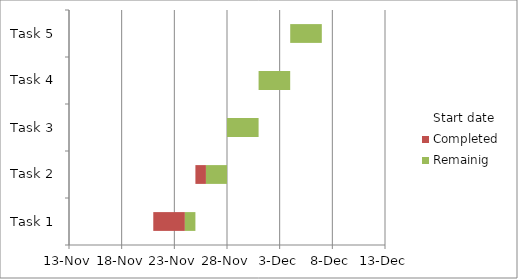
| Category | Start date | Completed | Remainig |
|---|---|---|---|
| Task 1 | 2011-11-21 | 3 | 1 |
| Task 2 | 2011-11-25 | 1 | 2 |
| Task 3 | 2011-11-28 | 0 | 3 |
| Task 4 | 2011-12-01 | 0 | 3 |
| Task 5 | 2011-12-04 | 0 | 3 |